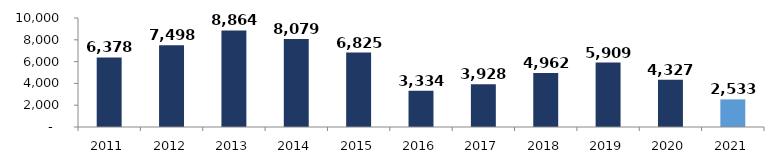
| Category | Series 0 |
|---|---|
| 2011.0 | 6377.615 |
| 2012.0 | 7498.207 |
| 2013.0 | 8863.622 |
| 2014.0 | 8079.21 |
| 2015.0 | 6824.624 |
| 2016.0 | 3333.564 |
| 2017.0 | 3928.017 |
| 2018.0 | 4961.838 |
| 2019.0 | 5908.679 |
| 2020.0 | 4327.23 |
| 2021.0 | 2533.48 |